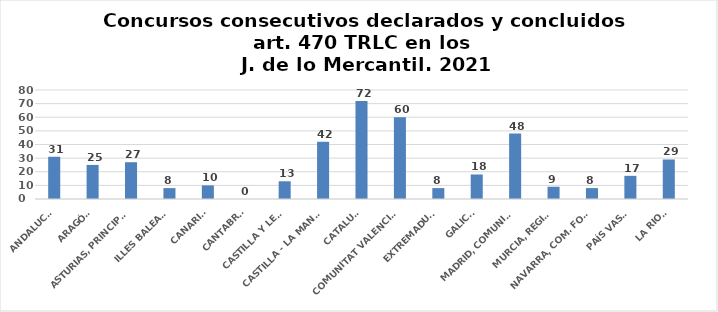
| Category | Series 0 |
|---|---|
| ANDALUCÍA | 31 |
| ARAGÓN | 25 |
| ASTURIAS, PRINCIPADO | 27 |
| ILLES BALEARS | 8 |
| CANARIAS | 10 |
| CANTABRIA | 0 |
| CASTILLA Y LEÓN | 13 |
| CASTILLA - LA MANCHA | 42 |
| CATALUÑA | 72 |
| COMUNITAT VALENCIANA | 60 |
| EXTREMADURA | 8 |
| GALICIA | 18 |
| MADRID, COMUNIDAD | 48 |
| MURCIA, REGIÓN | 9 |
| NAVARRA, COM. FORAL | 8 |
| PAÍS VASCO | 17 |
| LA RIOJA | 29 |